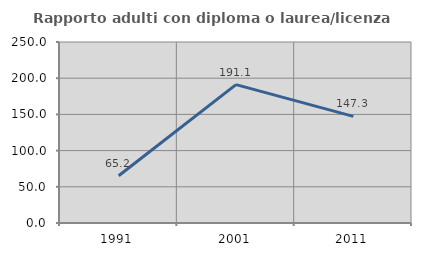
| Category | Rapporto adulti con diploma o laurea/licenza media  |
|---|---|
| 1991.0 | 65.217 |
| 2001.0 | 191.071 |
| 2011.0 | 147.297 |